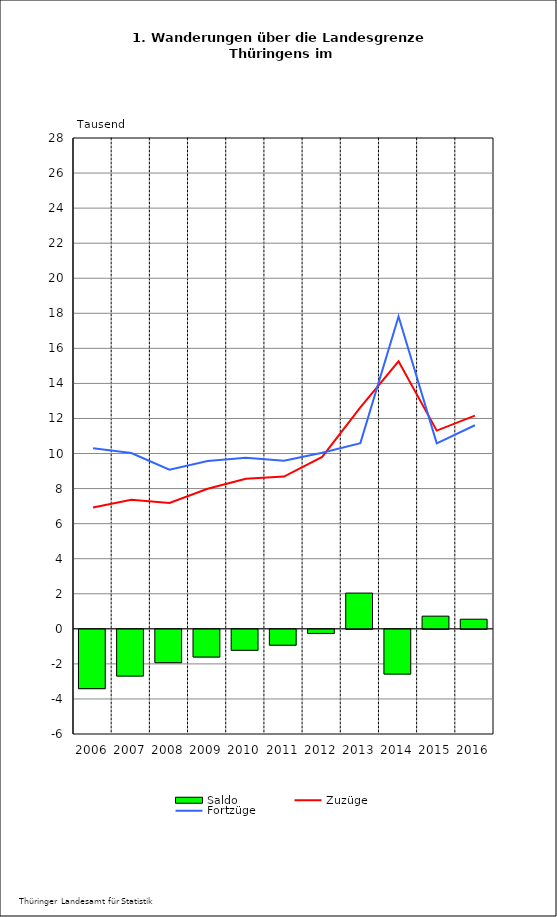
| Category | Saldo |
|---|---|
| 2006.0 | -3.384 |
| 2007.0 | -2.667 |
| 2008.0 | -1.902 |
| 2009.0 | -1.582 |
| 2010.0 | -1.198 |
| 2011.0 | -0.906 |
| 2012.0 | -0.235 |
| 2013.0 | 2.039 |
| 2014.0 | -2.554 |
| 2015.0 | 0.723 |
| 2016.0 | 0.548 |